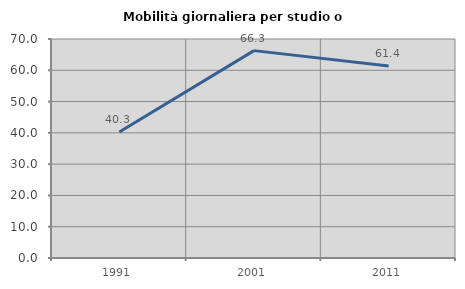
| Category | Mobilità giornaliera per studio o lavoro |
|---|---|
| 1991.0 | 40.272 |
| 2001.0 | 66.285 |
| 2011.0 | 61.355 |